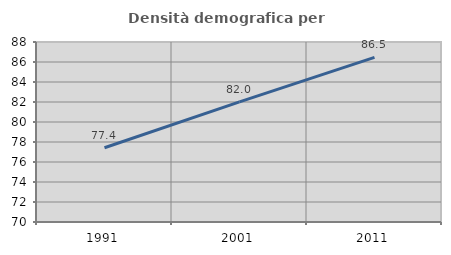
| Category | Densità demografica |
|---|---|
| 1991.0 | 77.427 |
| 2001.0 | 82.009 |
| 2011.0 | 86.462 |